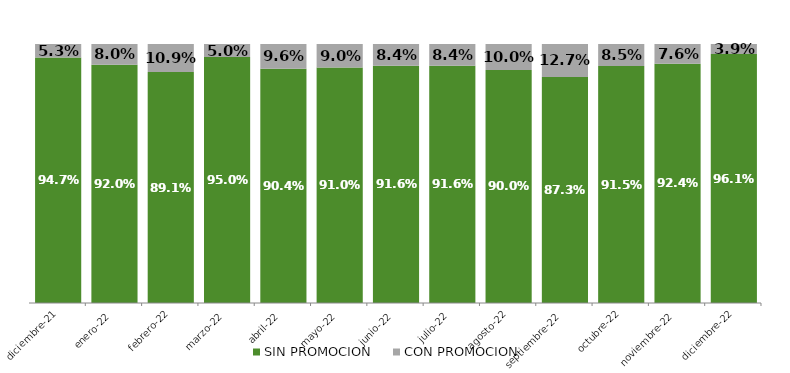
| Category | SIN PROMOCION   | CON PROMOCION   |
|---|---|---|
| 2021-12-01 | 0.947 | 0.053 |
| 2022-01-01 | 0.92 | 0.08 |
| 2022-02-01 | 0.891 | 0.109 |
| 2022-03-01 | 0.95 | 0.05 |
| 2022-04-01 | 0.904 | 0.096 |
| 2022-05-01 | 0.91 | 0.09 |
| 2022-06-01 | 0.916 | 0.084 |
| 2022-07-01 | 0.916 | 0.084 |
| 2022-08-01 | 0.9 | 0.1 |
| 2022-09-01 | 0.873 | 0.127 |
| 2022-10-01 | 0.915 | 0.085 |
| 2022-11-01 | 0.924 | 0.076 |
| 2022-12-01 | 0.961 | 0.039 |